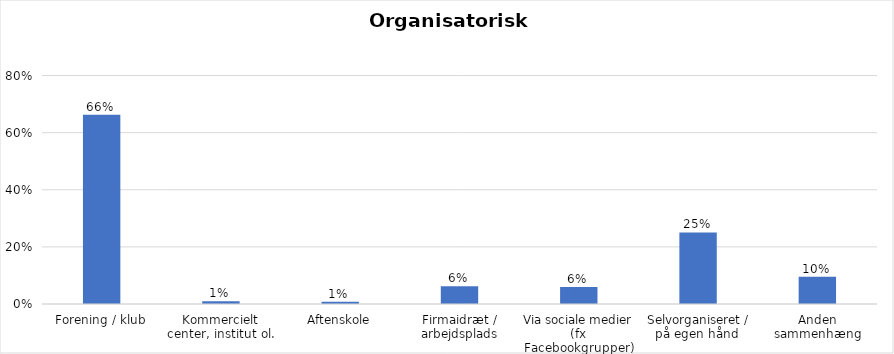
| Category | % |
|---|---|
| Forening / klub | 0.662 |
| Kommercielt center, institut ol. | 0.01 |
| Aftenskole | 0.008 |
| Firmaidræt / arbejdsplads | 0.062 |
| Via sociale medier (fx Facebookgrupper) | 0.06 |
| Selvorganiseret / på egen hånd  | 0.25 |
| Anden sammenhæng | 0.095 |